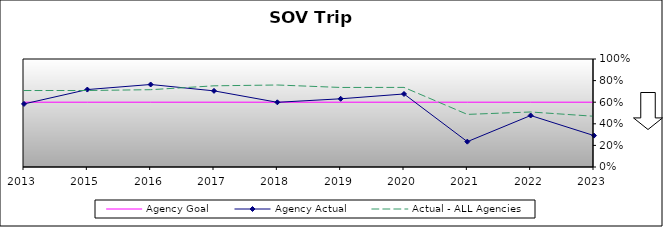
| Category | Agency Goal | Agency Actual | Actual - ALL Agencies |
|---|---|---|---|
| 2013.0 | 0.6 | 0.584 | 0.708 |
| 2015.0 | 0.6 | 0.717 | 0.708 |
| 2016.0 | 0.6 | 0.764 | 0.716 |
| 2017.0 | 0.6 | 0.705 | 0.752 |
| 2018.0 | 0.6 | 0.599 | 0.759 |
| 2019.0 | 0.6 | 0.632 | 0.736 |
| 2020.0 | 0.6 | 0.676 | 0.737 |
| 2021.0 | 0.6 | 0.235 | 0.487 |
| 2022.0 | 0.6 | 0.477 | 0.509 |
| 2023.0 | 0.6 | 0.291 | 0.47 |